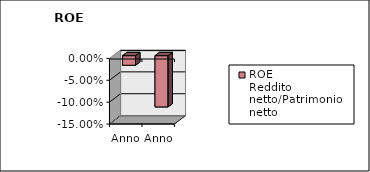
| Category | ROE
Reddito netto/Patrimonio netto |
|---|---|
| Anno 2023 | -0.022 |
| Anno 2022 | -0.117 |